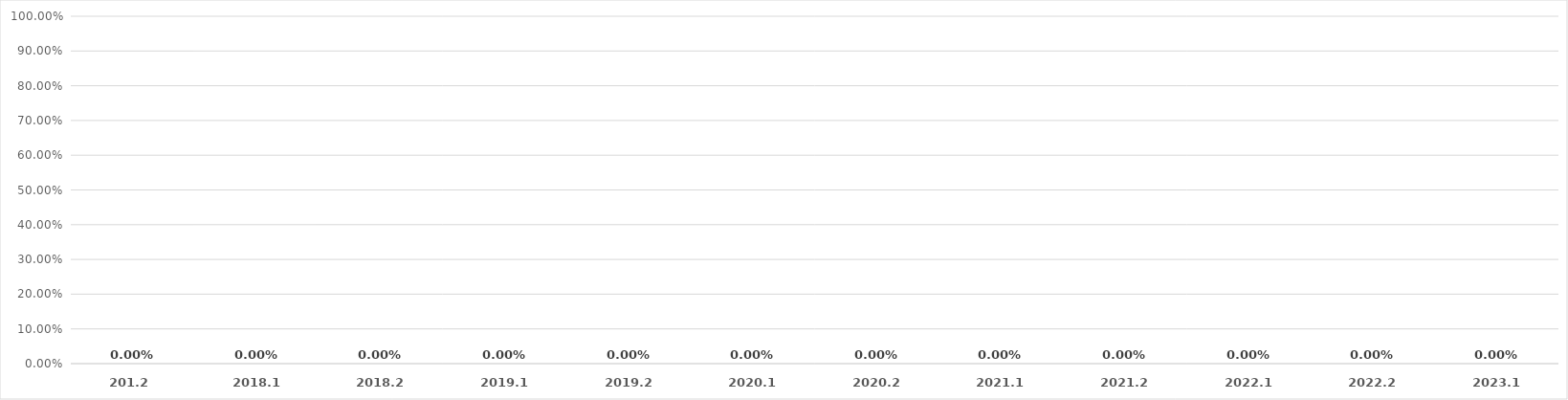
| Category | Series 0 |
|---|---|
| 201.2 | 0 |
| 2018.1 | 0 |
| 2018.2 | 0 |
| 2019.1 | 0 |
| 2019.2 | 0 |
| 2020.1 | 0 |
| 2020.2 | 0 |
| 2021.1 | 0 |
| 2021.2 | 0 |
| 2022.1 | 0 |
| 2022.2 | 0 |
| 2023.1 | 0 |